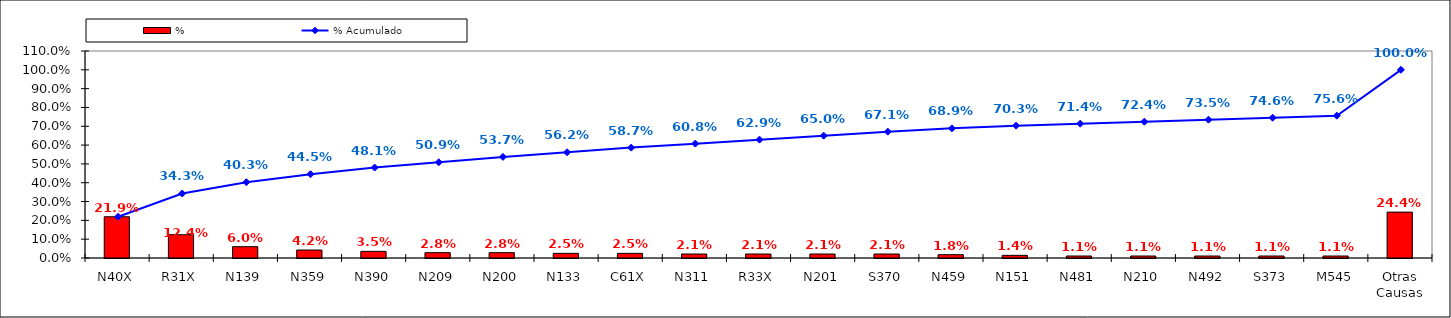
| Category | % |
|---|---|
| N40X | 0.219 |
| R31X | 0.124 |
| N139 | 0.06 |
| N359 | 0.042 |
| N390 | 0.035 |
| N209 | 0.028 |
| N200 | 0.028 |
| N133 | 0.025 |
| C61X | 0.025 |
| N311 | 0.021 |
| R33X | 0.021 |
| N201 | 0.021 |
| S370 | 0.021 |
| N459 | 0.018 |
| N151 | 0.014 |
| N481 | 0.011 |
| N210 | 0.011 |
| N492 | 0.011 |
| S373 | 0.011 |
| M545 | 0.011 |
| Otras Causas | 0.244 |